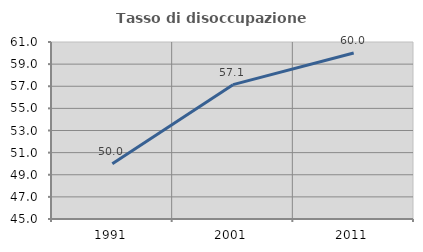
| Category | Tasso di disoccupazione giovanile  |
|---|---|
| 1991.0 | 50 |
| 2001.0 | 57.143 |
| 2011.0 | 60 |